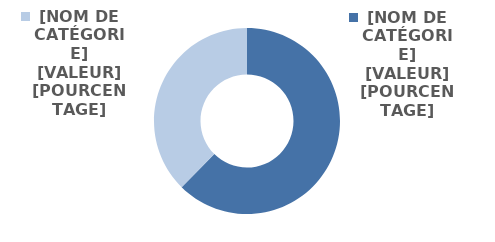
| Category | Series 0 |
|---|---|
| Etudiantes | 11395 |
| Etudiants | 6866 |